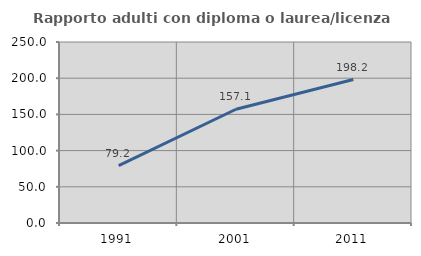
| Category | Rapporto adulti con diploma o laurea/licenza media  |
|---|---|
| 1991.0 | 79.245 |
| 2001.0 | 157.143 |
| 2011.0 | 198.165 |